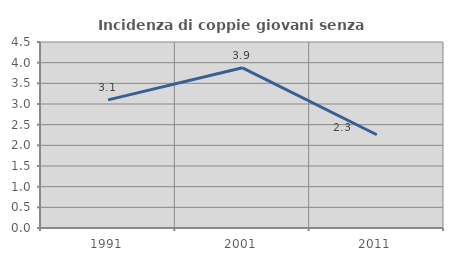
| Category | Incidenza di coppie giovani senza figli |
|---|---|
| 1991.0 | 3.101 |
| 2001.0 | 3.876 |
| 2011.0 | 2.256 |